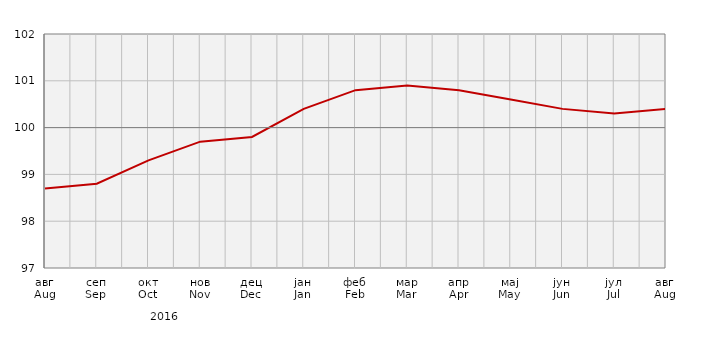
| Category | Индекси потрошачких цијена
Consumer price indices |
|---|---|
| авг
Aug | 98.7 |
| сеп
Sep | 98.8 |
| окт
Oct | 99.3 |
| нов
Nov | 99.7 |
| дец
Dec | 99.8 |
| јан
Jan | 100.4 |
| феб
Feb | 100.8 |
| мар
Mar | 100.9 |
| апр
Apr | 100.8 |
| мај
May | 100.6 |
| јун
Jun | 100.4 |
| јул
Jul | 100.3 |
| авг
Aug | 100.4 |